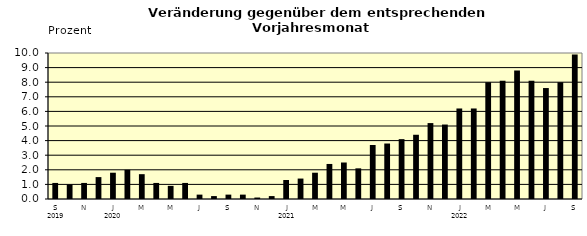
| Category | Series 0 |
|---|---|
| 0 | 1.1 |
| 1 | 1 |
| 2 | 1.1 |
| 3 | 1.5 |
| 4 | 1.8 |
| 5 | 2 |
| 6 | 1.7 |
| 7 | 1.1 |
| 8 | 0.9 |
| 9 | 1.1 |
| 10 | 0.3 |
| 11 | 0.2 |
| 12 | 0.3 |
| 13 | 0.3 |
| 14 | 0.1 |
| 15 | 0.2 |
| 16 | 1.3 |
| 17 | 1.4 |
| 18 | 1.8 |
| 19 | 2.4 |
| 20 | 2.5 |
| 21 | 2.1 |
| 22 | 3.7 |
| 23 | 3.8 |
| 24 | 4.1 |
| 25 | 4.4 |
| 26 | 5.2 |
| 27 | 5.1 |
| 28 | 6.2 |
| 29 | 6.2 |
| 30 | 8 |
| 31 | 8.1 |
| 32 | 8.8 |
| 33 | 8.1 |
| 34 | 7.6 |
| 35 | 8 |
| 36 | 9.9 |